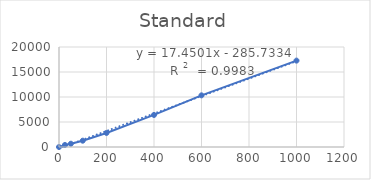
| Category | Series 0 |
|---|---|
| 0.0 | 0 |
| 25.0 | 407.64 |
| 50.0 | 655.69 |
| 100.0 | 1261.49 |
| 200.0 | 2813.09 |
| 400.0 | 6411.523 |
| 600.0 | 10331.19 |
| 1000.0 | 17277.523 |